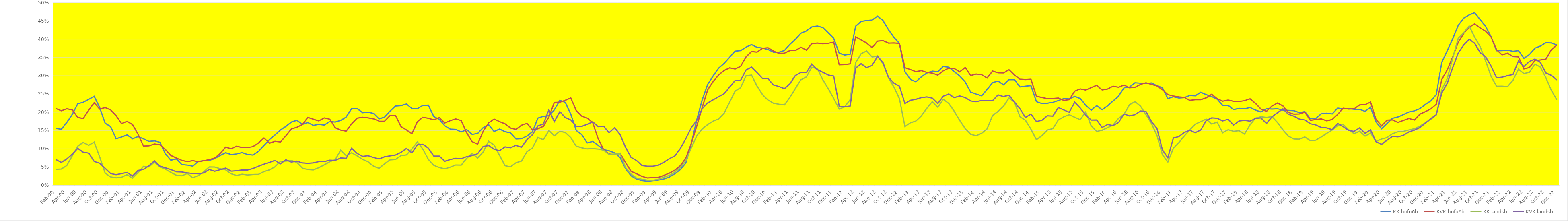
| Category | KK höfuðb | KVK höfuðb | KK landsb | KVK landsb |
|---|---|---|---|---|
| Feb-00 | 0.156 | 0.21 | 0.043 | 0.07 |
| Mar-00 | 0.153 | 0.204 | 0.044 | 0.062 |
| Apr-00 | 0.172 | 0.209 | 0.054 | 0.072 |
| May-00 | 0.194 | 0.206 | 0.081 | 0.085 |
| Jun-00 | 0.223 | 0.186 | 0.107 | 0.101 |
| Jul-00 | 0.227 | 0.183 | 0.117 | 0.09 |
| Aug-00 | 0.235 | 0.205 | 0.109 | 0.088 |
| Sep-00 | 0.244 | 0.226 | 0.118 | 0.065 |
| Oct-00 | 0.213 | 0.209 | 0.077 | 0.06 |
| Nov-00 | 0.17 | 0.213 | 0.033 | 0.046 |
| Dec-00 | 0.16 | 0.206 | 0.023 | 0.032 |
| Jan-01 | 0.127 | 0.191 | 0.02 | 0.029 |
| Feb-01 | 0.132 | 0.169 | 0.022 | 0.032 |
| Mar-01 | 0.138 | 0.175 | 0.029 | 0.035 |
| Apr-01 | 0.127 | 0.166 | 0.019 | 0.025 |
| May-01 | 0.133 | 0.14 | 0.034 | 0.04 |
| Jun-01 | 0.127 | 0.107 | 0.051 | 0.043 |
| Jul-01 | 0.12 | 0.108 | 0.05 | 0.053 |
| Aug-01 | 0.122 | 0.113 | 0.063 | 0.067 |
| Sep-01 | 0.118 | 0.111 | 0.05 | 0.052 |
| Oct-01 | 0.086 | 0.098 | 0.044 | 0.047 |
| Nov-01 | 0.068 | 0.081 | 0.035 | 0.043 |
| Dec-01 | 0.072 | 0.074 | 0.027 | 0.037 |
| Jan-02 | 0.056 | 0.068 | 0.026 | 0.036 |
| Feb-02 | 0.055 | 0.064 | 0.032 | 0.034 |
| Mar-02 | 0.052 | 0.067 | 0.02 | 0.032 |
| Apr-02 | 0.065 | 0.064 | 0.026 | 0.031 |
| May-02 | 0.067 | 0.067 | 0.037 | 0.034 |
| Jun-02 | 0.068 | 0.07 | 0.05 | 0.043 |
| Jul-02 | 0.073 | 0.074 | 0.05 | 0.038 |
| Aug-02 | 0.082 | 0.087 | 0.045 | 0.042 |
| Sep-02 | 0.089 | 0.104 | 0.042 | 0.047 |
| Oct-02 | 0.084 | 0.1 | 0.031 | 0.038 |
| Nov-02 | 0.086 | 0.107 | 0.027 | 0.039 |
| Dec-02 | 0.089 | 0.103 | 0.03 | 0.042 |
| Jan-03 | 0.084 | 0.103 | 0.028 | 0.042 |
| Feb-03 | 0.083 | 0.106 | 0.029 | 0.046 |
| Mar-03 | 0.093 | 0.116 | 0.03 | 0.052 |
| Apr-03 | 0.109 | 0.129 | 0.037 | 0.058 |
| May-03 | 0.125 | 0.115 | 0.042 | 0.062 |
| Jun-03 | 0.138 | 0.12 | 0.05 | 0.068 |
| Jul-03 | 0.151 | 0.118 | 0.065 | 0.059 |
| Aug-03 | 0.161 | 0.135 | 0.066 | 0.069 |
| Sep-03 | 0.173 | 0.154 | 0.068 | 0.063 |
| Oct-03 | 0.178 | 0.159 | 0.062 | 0.066 |
| Nov-03 | 0.167 | 0.166 | 0.047 | 0.061 |
| Dec-03 | 0.172 | 0.186 | 0.043 | 0.06 |
| Jan-04 | 0.164 | 0.181 | 0.042 | 0.061 |
| Feb-04 | 0.167 | 0.176 | 0.048 | 0.064 |
| Mar-04 | 0.165 | 0.185 | 0.056 | 0.065 |
| Apr-04 | 0.175 | 0.181 | 0.064 | 0.068 |
| May-04 | 0.173 | 0.158 | 0.07 | 0.068 |
| Jun-04 | 0.178 | 0.151 | 0.096 | 0.075 |
| Jul-04 | 0.187 | 0.148 | 0.081 | 0.074 |
| Aug-04 | 0.21 | 0.168 | 0.089 | 0.101 |
| Sep-04 | 0.21 | 0.184 | 0.08 | 0.087 |
| Oct-04 | 0.199 | 0.186 | 0.071 | 0.079 |
| Nov-04 | 0.2 | 0.185 | 0.064 | 0.081 |
| Dec-04 | 0.197 | 0.182 | 0.052 | 0.076 |
| Jan-05 | 0.182 | 0.176 | 0.046 | 0.072 |
| Feb-05 | 0.187 | 0.175 | 0.059 | 0.078 |
| Mar-05 | 0.203 | 0.191 | 0.069 | 0.08 |
| Apr-05 | 0.217 | 0.191 | 0.07 | 0.083 |
| May-05 | 0.218 | 0.161 | 0.081 | 0.09 |
| Jun-05 | 0.223 | 0.151 | 0.083 | 0.101 |
| Jul-05 | 0.21 | 0.141 | 0.099 | 0.089 |
| Aug-05 | 0.21 | 0.174 | 0.119 | 0.111 |
| Sep-05 | 0.219 | 0.186 | 0.099 | 0.112 |
| Oct-05 | 0.219 | 0.184 | 0.071 | 0.102 |
| Nov-05 | 0.188 | 0.179 | 0.054 | 0.08 |
| Dec-05 | 0.181 | 0.185 | 0.048 | 0.08 |
| Jan-06 | 0.163 | 0.171 | 0.045 | 0.065 |
| Feb-06 | 0.154 | 0.177 | 0.049 | 0.07 |
| Mar-06 | 0.153 | 0.182 | 0.055 | 0.074 |
| Apr-06 | 0.146 | 0.177 | 0.055 | 0.072 |
| May-06 | 0.152 | 0.143 | 0.074 | 0.078 |
| Jun-06 | 0.139 | 0.119 | 0.087 | 0.081 |
| Jul-06 | 0.142 | 0.113 | 0.075 | 0.086 |
| Aug-06 | 0.158 | 0.147 | 0.091 | 0.106 |
| Sep-06 | 0.166 | 0.171 | 0.121 | 0.109 |
| Oct-06 | 0.147 | 0.181 | 0.11 | 0.099 |
| Nov-06 | 0.154 | 0.174 | 0.082 | 0.094 |
| Dec-06 | 0.147 | 0.168 | 0.053 | 0.105 |
| Jan-07 | 0.143 | 0.157 | 0.05 | 0.103 |
| Feb-07 | 0.127 | 0.153 | 0.061 | 0.109 |
| Mar-07 | 0.127 | 0.164 | 0.066 | 0.104 |
| Apr-07 | 0.135 | 0.169 | 0.092 | 0.125 |
| May-07 | 0.146 | 0.152 | 0.102 | 0.138 |
| Jun-07 | 0.184 | 0.155 | 0.131 | 0.162 |
| Jul-07 | 0.189 | 0.161 | 0.124 | 0.168 |
| Aug-07 | 0.191 | 0.187 | 0.15 | 0.207 |
| Sep-07 | 0.207 | 0.227 | 0.136 | 0.174 |
| Oct-07 | 0.232 | 0.227 | 0.148 | 0.202 |
| Nov-07 | 0.227 | 0.233 | 0.144 | 0.186 |
| Dec-07 | 0.195 | 0.239 | 0.13 | 0.179 |
| Jan-08 | 0.15 | 0.204 | 0.107 | 0.162 |
| Feb-08 | 0.139 | 0.189 | 0.103 | 0.161 |
| Mar-08 | 0.116 | 0.184 | 0.099 | 0.167 |
| Apr-08 | 0.12 | 0.172 | 0.101 | 0.174 |
| May-08 | 0.109 | 0.127 | 0.099 | 0.16 |
| Jun-08 | 0.098 | 0.098 | 0.096 | 0.162 |
| Jul-08 | 0.094 | 0.085 | 0.084 | 0.144 |
| Aug-08 | 0.089 | 0.083 | 0.085 | 0.158 |
| Sep-08 | 0.076 | 0.088 | 0.086 | 0.139 |
| Oct-08 | 0.045 | 0.062 | 0.048 | 0.104 |
| Nov-08 | 0.026 | 0.038 | 0.03 | 0.076 |
| Dec-08 | 0.017 | 0.031 | 0.02 | 0.068 |
| Jan-09 | 0.013 | 0.024 | 0.016 | 0.054 |
| Feb-09 | 0.011 | 0.02 | 0.014 | 0.052 |
| Mar-09 | 0.012 | 0.021 | 0.013 | 0.052 |
| Apr-09 | 0.014 | 0.021 | 0.016 | 0.055 |
| May-09 | 0.017 | 0.027 | 0.022 | 0.063 |
| Jun-09 | 0.023 | 0.033 | 0.027 | 0.073 |
| Jul-09 | 0.031 | 0.041 | 0.036 | 0.08 |
| Aug-09 | 0.043 | 0.053 | 0.048 | 0.1 |
| Sep-09 | 0.061 | 0.074 | 0.067 | 0.127 |
| Oct-09 | 0.114 | 0.115 | 0.102 | 0.157 |
| Nov-09 | 0.179 | 0.162 | 0.135 | 0.177 |
| Dec-09 | 0.234 | 0.213 | 0.154 | 0.21 |
| Jan-10 | 0.277 | 0.262 | 0.166 | 0.226 |
| Feb-10 | 0.3 | 0.284 | 0.176 | 0.234 |
| Mar-10 | 0.321 | 0.302 | 0.182 | 0.243 |
| Apr-10 | 0.334 | 0.315 | 0.198 | 0.251 |
| May-10 | 0.351 | 0.322 | 0.227 | 0.269 |
| Jun-10 | 0.368 | 0.319 | 0.258 | 0.287 |
| Jul-10 | 0.369 | 0.326 | 0.267 | 0.287 |
| Aug-10 | 0.379 | 0.352 | 0.3 | 0.316 |
| Sep-10 | 0.385 | 0.367 | 0.302 | 0.324 |
| Oct-10 | 0.378 | 0.365 | 0.272 | 0.309 |
| Nov-10 | 0.376 | 0.375 | 0.248 | 0.293 |
| Dec-10 | 0.372 | 0.377 | 0.233 | 0.292 |
| Jan-11 | 0.365 | 0.368 | 0.225 | 0.275 |
| Feb-11 | 0.365 | 0.362 | 0.222 | 0.271 |
| Mar-11 | 0.369 | 0.362 | 0.22 | 0.265 |
| Apr-11 | 0.386 | 0.369 | 0.24 | 0.278 |
| May-11 | 0.4 | 0.369 | 0.265 | 0.301 |
| Jun-11 | 0.417 | 0.378 | 0.289 | 0.309 |
| Jul-11 | 0.423 | 0.37 | 0.297 | 0.308 |
| Aug-11 | 0.434 | 0.388 | 0.323 | 0.332 |
| Sep-11 | 0.436 | 0.39 | 0.32 | 0.317 |
| Oct-11 | 0.432 | 0.388 | 0.289 | 0.309 |
| Nov-11 | 0.418 | 0.389 | 0.265 | 0.302 |
| Dec-11 | 0.402 | 0.392 | 0.238 | 0.299 |
| Jan-12 | 0.362 | 0.33 | 0.209 | 0.216 |
| Feb-12 | 0.357 | 0.331 | 0.215 | 0.215 |
| Mar-12 | 0.359 | 0.333 | 0.234 | 0.217 |
| Apr-12 | 0.436 | 0.407 | 0.336 | 0.321 |
| May-12 | 0.449 | 0.398 | 0.361 | 0.333 |
| Jun-12 | 0.451 | 0.39 | 0.368 | 0.322 |
| Jul-12 | 0.453 | 0.377 | 0.352 | 0.328 |
| Aug-12 | 0.463 | 0.395 | 0.354 | 0.354 |
| Sep-12 | 0.452 | 0.396 | 0.333 | 0.336 |
| Oct-12 | 0.426 | 0.389 | 0.294 | 0.295 |
| Nov-12 | 0.405 | 0.39 | 0.269 | 0.28 |
| Dec-12 | 0.388 | 0.389 | 0.237 | 0.272 |
| Jan-13 | 0.312 | 0.322 | 0.161 | 0.224 |
| Feb-13 | 0.29 | 0.317 | 0.171 | 0.233 |
| Mar-13 | 0.283 | 0.311 | 0.176 | 0.235 |
| Apr-13 | 0.297 | 0.314 | 0.19 | 0.24 |
| May-13 | 0.307 | 0.309 | 0.211 | 0.242 |
| Jun-13 | 0.313 | 0.307 | 0.229 | 0.239 |
| Jul-13 | 0.311 | 0.301 | 0.214 | 0.224 |
| Aug-13 | 0.325 | 0.314 | 0.235 | 0.244 |
| Sep-13 | 0.323 | 0.321 | 0.224 | 0.25 |
| Oct-13 | 0.311 | 0.32 | 0.203 | 0.24 |
| Nov-13 | 0.3 | 0.311 | 0.178 | 0.245 |
| Dec-13 | 0.283 | 0.323 | 0.155 | 0.24 |
| Jan-14 | 0.255 | 0.301 | 0.139 | 0.231 |
| Feb-14 | 0.25 | 0.305 | 0.135 | 0.229 |
| Mar-14 | 0.245 | 0.303 | 0.142 | 0.232 |
| Apr-14 | 0.262 | 0.294 | 0.154 | 0.232 |
| May-14 | 0.281 | 0.313 | 0.191 | 0.232 |
| Jun-14 | 0.285 | 0.308 | 0.202 | 0.248 |
| Jul-14 | 0.275 | 0.308 | 0.216 | 0.243 |
| Aug-14 | 0.289 | 0.316 | 0.239 | 0.247 |
| Sep-14 | 0.289 | 0.302 | 0.227 | 0.228 |
| Oct-14 | 0.269 | 0.291 | 0.188 | 0.209 |
| Nov-14 | 0.272 | 0.289 | 0.178 | 0.186 |
| Dec-14 | 0.273 | 0.29 | 0.153 | 0.195 |
| Jan-15 | 0.229 | 0.244 | 0.125 | 0.174 |
| Feb-15 | 0.224 | 0.24 | 0.136 | 0.178 |
| Mar-15 | 0.225 | 0.237 | 0.151 | 0.19 |
| Apr-15 | 0.227 | 0.238 | 0.155 | 0.189 |
| May-15 | 0.232 | 0.239 | 0.179 | 0.213 |
| Jun-15 | 0.237 | 0.232 | 0.188 | 0.206 |
| Jul-15 | 0.236 | 0.234 | 0.193 | 0.2 |
| Aug-15 | 0.244 | 0.258 | 0.186 | 0.228 |
| Sep-15 | 0.238 | 0.264 | 0.18 | 0.211 |
| Oct-15 | 0.219 | 0.261 | 0.201 | 0.192 |
| Nov-15 | 0.206 | 0.268 | 0.163 | 0.178 |
| Dec-15 | 0.218 | 0.274 | 0.147 | 0.179 |
| Jan-16 | 0.207 | 0.261 | 0.151 | 0.158 |
| Feb-16 | 0.218 | 0.264 | 0.158 | 0.166 |
| Mar-16 | 0.231 | 0.272 | 0.165 | 0.163 |
| Apr-16 | 0.244 | 0.269 | 0.183 | 0.172 |
| May-16 | 0.267 | 0.275 | 0.194 | 0.195 |
| Jun-16 | 0.269 | 0.267 | 0.22 | 0.19 |
| Jul-16 | 0.281 | 0.268 | 0.229 | 0.193 |
| Aug-16 | 0.28 | 0.276 | 0.217 | 0.203 |
| Sep-16 | 0.279 | 0.281 | 0.193 | 0.202 |
| Oct-16 | 0.28 | 0.277 | 0.169 | 0.174 |
| Nov-16 | 0.273 | 0.272 | 0.137 | 0.156 |
| Dec-16 | 0.267 | 0.262 | 0.084 | 0.097 |
| Jan-17 | 0.237 | 0.248 | 0.064 | 0.075 |
| Feb-17 | 0.243 | 0.244 | 0.101 | 0.129 |
| Mar-17 | 0.239 | 0.242 | 0.117 | 0.133 |
| Apr-17 | 0.24 | 0.241 | 0.135 | 0.144 |
| May-17 | 0.246 | 0.233 | 0.151 | 0.151 |
| Jun-17 | 0.245 | 0.234 | 0.167 | 0.144 |
| Jul-17 | 0.255 | 0.234 | 0.174 | 0.151 |
| Aug-17 | 0.248 | 0.239 | 0.181 | 0.177 |
| Sep-17 | 0.243 | 0.249 | 0.168 | 0.184 |
| Oct-17 | 0.236 | 0.237 | 0.173 | 0.183 |
| Nov-17 | 0.219 | 0.23 | 0.144 | 0.176 |
| Dec-17 | 0.219 | 0.233 | 0.152 | 0.181 |
| Jan-18 | 0.207 | 0.23 | 0.148 | 0.165 |
| Feb-18 | 0.21 | 0.229 | 0.149 | 0.176 |
| Mar-18 | 0.209 | 0.232 | 0.14 | 0.178 |
| Apr-18 | 0.213 | 0.237 | 0.166 | 0.176 |
| May-18 | 0.206 | 0.224 | 0.184 | 0.183 |
| Jun-18 | 0.201 | 0.209 | 0.188 | 0.185 |
| Jul-18 | 0.21 | 0.202 | 0.186 | 0.169 |
| Aug-18 | 0.209 | 0.217 | 0.188 | 0.187 |
| Sep-18 | 0.21 | 0.225 | 0.172 | 0.199 |
| Oct-18 | 0.206 | 0.217 | 0.152 | 0.209 |
| Nov-18 | 0.205 | 0.199 | 0.134 | 0.194 |
| Dec-18 | 0.204 | 0.195 | 0.127 | 0.189 |
| Jan-19 | 0.199 | 0.195 | 0.126 | 0.181 |
| Feb-19 | 0.202 | 0.2 | 0.132 | 0.179 |
| Mar-19 | 0.182 | 0.178 | 0.122 | 0.168 |
| Apr-19 | 0.183 | 0.18 | 0.123 | 0.165 |
| May-19 | 0.196 | 0.182 | 0.132 | 0.158 |
| Jun-19 | 0.197 | 0.176 | 0.142 | 0.157 |
| Jul-19 | 0.195 | 0.18 | 0.151 | 0.152 |
| Aug-19 | 0.211 | 0.194 | 0.163 | 0.169 |
| Sep-19 | 0.209 | 0.211 | 0.167 | 0.161 |
| Oct-19 | 0.21 | 0.209 | 0.152 | 0.15 |
| Nov-19 | 0.208 | 0.209 | 0.141 | 0.147 |
| Dec-19 | 0.208 | 0.22 | 0.148 | 0.157 |
| Jan-20 | 0.202 | 0.221 | 0.134 | 0.142 |
| Feb-20 | 0.213 | 0.228 | 0.143 | 0.151 |
| mars.20* | 0.173 | 0.18 | 0.12 | 0.119 |
| Apr-20 | 0.155 | 0.163 | 0.126 | 0.112 |
| May-20 | 0.169 | 0.178 | 0.13 | 0.123 |
| Jun-20 | 0.183 | 0.179 | 0.141 | 0.134 |
| Jul-20 | 0.187 | 0.172 | 0.146 | 0.132 |
| Aug-20 | 0.194 | 0.178 | 0.147 | 0.137 |
| Sep-20 | 0.201 | 0.183 | 0.151 | 0.146 |
| Oct-20 | 0.204 | 0.179 | 0.155 | 0.151 |
| Nov-20 | 0.21 | 0.195 | 0.162 | 0.158 |
| Dec-20 | 0.221 | 0.202 | 0.171 | 0.17 |
| Jan-21 | 0.231 | 0.209 | 0.18 | 0.183 |
| Feb-21 | 0.248 | 0.222 | 0.193 | 0.193 |
| Mar-21 | 0.337 | 0.29 | 0.262 | 0.253 |
| Apr-21 | 0.369 | 0.316 | 0.292 | 0.279 |
| May-21 | 0.402 | 0.352 | 0.349 | 0.323 |
| Jun-21 | 0.438 | 0.392 | 0.403 | 0.362 |
| Jul-21 | 0.458 | 0.416 | 0.418 | 0.384 |
| Aug-21 | 0.467 | 0.433 | 0.437 | 0.4 |
| Sep-21 | 0.473 | 0.443 | 0.406 | 0.389 |
| Oct-21 | 0.454 | 0.431 | 0.38 | 0.364 |
| Nov-21 | 0.435 | 0.422 | 0.341 | 0.352 |
| Dec-21 | 0.407 | 0.406 | 0.298 | 0.326 |
| Jan-22 | 0.369 | 0.371 | 0.271 | 0.294 |
| Feb-22 | 0.369 | 0.357 | 0.271 | 0.296 |
| Mar-22 | 0.37 | 0.362 | 0.27 | 0.3 |
| Apr-22 | 0.367 | 0.353 | 0.288 | 0.303 |
| May-22 | 0.369 | 0.352 | 0.318 | 0.341 |
| Jun-22 | 0.348 | 0.319 | 0.306 | 0.325 |
| Jul-22 | 0.358 | 0.323 | 0.31 | 0.339 |
| Aug-22 | 0.376 | 0.342 | 0.332 | 0.346 |
| Sep-22 | 0.381 | 0.343 | 0.324 | 0.337 |
| Oct-22 | 0.39 | 0.345 | 0.295 | 0.308 |
| Nov-22 | 0.39 | 0.372 | 0.26 | 0.301 |
| Dec-22 | 0.384 | 0.384 | 0.234 | 0.288 |